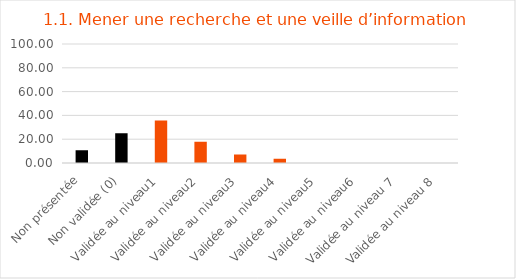
| Category | Series 0 |
|---|---|
| Non présentée | 10.714 |
| Non validée (0) | 25 |
| Validée au niveau1 | 35.714 |
| Validée au niveau2 | 17.857 |
| Validée au niveau3 | 7.143 |
| Validée au niveau4 | 3.571 |
| Validée au niveau5 | 0 |
| Validée au niveau6 | 0 |
| Validée au niveau 7 | 0 |
| Validée au niveau 8 | 0 |